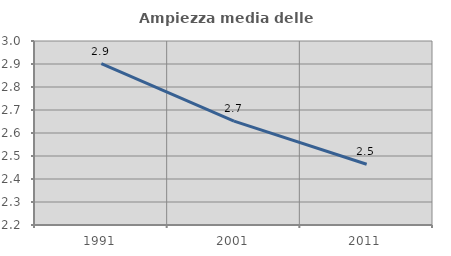
| Category | Ampiezza media delle famiglie |
|---|---|
| 1991.0 | 2.901 |
| 2001.0 | 2.652 |
| 2011.0 | 2.464 |